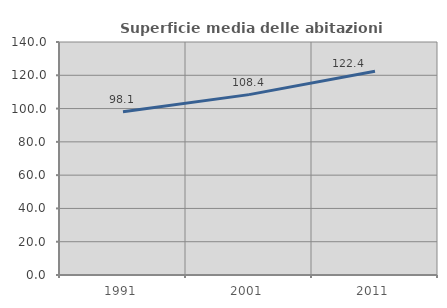
| Category | Superficie media delle abitazioni occupate |
|---|---|
| 1991.0 | 98.115 |
| 2001.0 | 108.382 |
| 2011.0 | 122.403 |